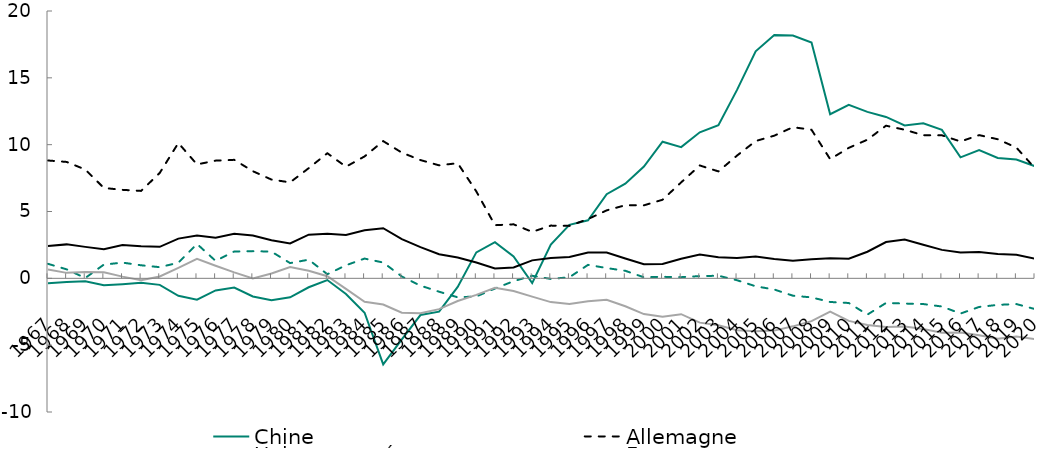
| Category | Chine | Allemagne | Union européenne | France | Etats-Unis |
|---|---|---|---|---|---|
| 1967 | -0.375 | 8.816 | 2.424 | 1.085 | 0.665 |
| 1968 | -0.283 | 8.709 | 2.54 | 0.672 | 0.409 |
| 1969 | -0.214 | 8.141 | 2.353 | 0.026 | 0.47 |
| 1970 | -0.517 | 6.761 | 2.176 | 1.029 | 0.455 |
| 1971 | -0.438 | 6.62 | 2.496 | 1.177 | 0.127 |
| 1972 | -0.334 | 6.54 | 2.404 | 0.977 | -0.134 |
| 1973 | -0.489 | 7.886 | 2.355 | 0.836 | 0.136 |
| 1974 | -1.31 | 10.125 | 2.971 | 1.167 | 0.778 |
| 1975 | -1.592 | 8.521 | 3.212 | 2.574 | 1.452 |
| 1976 | -0.906 | 8.807 | 3.039 | 1.304 | 0.941 |
| 1977 | -0.686 | 8.865 | 3.327 | 2.008 | 0.446 |
| 1978 | -1.356 | 8.015 | 3.203 | 2.036 | -0.011 |
| 1979 | -1.636 | 7.389 | 2.842 | 1.999 | 0.365 |
| 1980 | -1.417 | 7.179 | 2.612 | 1.14 | 0.852 |
| 1981 | -0.668 | 8.242 | 3.267 | 1.396 | 0.572 |
| 1982 | -0.128 | 9.359 | 3.339 | 0.307 | 0.159 |
| 1983 | -1.169 | 8.35 | 3.246 | 0.976 | -0.785 |
| 1984 | -2.572 | 9.122 | 3.6 | 1.479 | -1.755 |
| 1985 | -6.441 | 10.266 | 3.748 | 1.181 | -1.958 |
| 1986 | -4.564 | 9.403 | 2.935 | 0.138 | -2.572 |
| 1987 | -2.745 | 8.848 | 2.33 | -0.547 | -2.611 |
| 1988 | -2.494 | 8.454 | 1.808 | -1 | -2.304 |
| 1989 | -0.639 | 8.616 | 1.56 | -1.42 | -1.7 |
| 1990 | 1.941 | 6.501 | 1.184 | -1.356 | -1.235 |
| 1991 | 2.702 | 3.976 | 0.744 | -0.764 | -0.706 |
| 1992 | 1.633 | 4.041 | 0.813 | -0.213 | -0.951 |
| 1993 | -0.357 | 3.477 | 1.345 | 0.192 | -1.366 |
| 1994 | 2.521 | 3.944 | 1.528 | -0.046 | -1.777 |
| 1995 | 4.004 | 3.924 | 1.6 | 0.081 | -1.913 |
| 1996 | 4.345 | 4.436 | 1.935 | 1.007 | -1.719 |
| 1997 | 6.299 | 5.085 | 1.928 | 0.769 | -1.6 |
| 1998 | 7.086 | 5.47 | 1.482 | 0.565 | -2.087 |
| 1999 | 8.365 | 5.462 | 1.049 | 0.076 | -2.677 |
| 2000 | 10.219 | 5.878 | 1.075 | 0.113 | -2.875 |
| 2001 | 9.818 | 7.181 | 1.466 | 0.088 | -2.683 |
| 2002 | 10.927 | 8.444 | 1.776 | 0.166 | -3.315 |
| 2003 | 11.451 | 7.999 | 1.583 | 0.194 | -3.513 |
| 2004 | 14.099 | 9.184 | 1.526 | -0.142 | -3.889 |
| 2005 | 16.986 | 10.271 | 1.626 | -0.595 | -3.968 |
| 2006 | 18.205 | 10.674 | 1.448 | -0.836 | -3.911 |
| 2007 | 18.16 | 11.308 | 1.313 | -1.298 | -3.592 |
| 2008 | 17.648 | 11.114 | 1.429 | -1.428 | -3.205 |
| 2009 | 12.279 | 8.917 | 1.498 | -1.769 | -2.487 |
| 2010 | 12.981 | 9.762 | 1.471 | -1.844 | -3.183 |
| 2011 | 12.455 | 10.372 | 1.992 | -2.715 | -3.485 |
| 2012 | 12.073 | 11.42 | 2.717 | -1.842 | -3.641 |
| 2013 | 11.437 | 11.116 | 2.897 | -1.887 | -3.61 |
| 2014 | 11.598 | 10.708 | 2.507 | -1.924 | -3.783 |
| 2015 | 11.103 | 10.699 | 2.129 | -2.107 | -4.068 |
| 2016 | 9.052 | 10.237 | 1.932 | -2.634 | -4.051 |
| 2017 | 9.603 | 10.715 | 1.978 | -2.141 | -4.255 |
| 2018 | 9.01 | 10.406 | 1.824 | -1.985 | -4.516 |
| 2019 | 8.895 | 9.781 | 1.762 | -1.925 | -4.348 |
| 2020 | 8.387 | 8.233 | 1.461 | -2.3 | -4.55 |